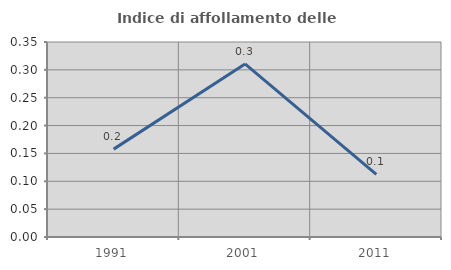
| Category | Indice di affollamento delle abitazioni  |
|---|---|
| 1991.0 | 0.158 |
| 2001.0 | 0.311 |
| 2011.0 | 0.112 |